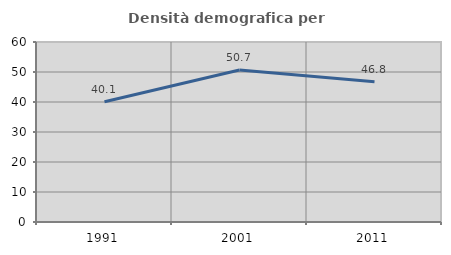
| Category | Densità demografica |
|---|---|
| 1991.0 | 40.098 |
| 2001.0 | 50.677 |
| 2011.0 | 46.752 |